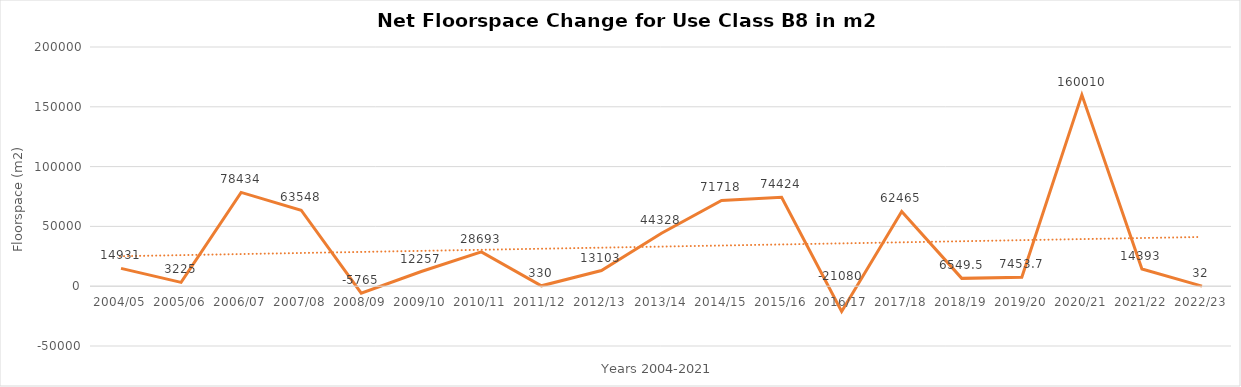
| Category | Series 0 |
|---|---|
| 2004/05 | 14931 |
| 2005/06 | 3225 |
| 2006/07 | 78434 |
| 2007/08 | 63548 |
| 2008/09 | -5765 |
| 2009/10 | 12257 |
| 2010/11 | 28693 |
| 2011/12 | 330 |
| 2012/13 | 13103 |
| 2013/14 | 44328 |
| 2014/15 | 71718 |
| 2015/16 | 74424 |
| 2016/17 | -21080 |
| 2017/18 | 62465 |
| 2018/19 | 6549.5 |
| 2019/20 | 7453.7 |
| 2020/21 | 160010 |
| 2021/22 | 14393 |
| 2022/23 | 32 |